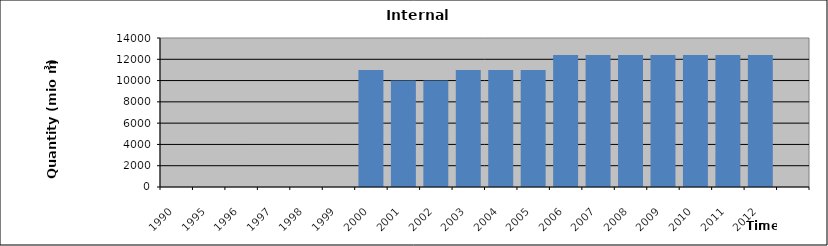
| Category | 1990 1995 1996 1997 1998 1999 2000 2001 2002 2003 2004 2005 2006 2007 2008 2009 2010 2011 2012 |
|---|---|
| 1990.0 | 0 |
| 1995.0 | 0 |
| 1996.0 | 0 |
| 1997.0 | 0 |
| 1998.0 | 0 |
| 1999.0 | 0 |
| 2000.0 | 11000 |
| 2001.0 | 10000 |
| 2002.0 | 10000 |
| 2003.0 | 11000 |
| 2004.0 | 11000 |
| 2005.0 | 11000 |
| 2006.0 | 12400 |
| 2007.0 | 12400 |
| 2008.0 | 12400 |
| 2009.0 | 12400 |
| 2010.0 | 12400 |
| 2011.0 | 12400 |
| 2012.0 | 12400 |